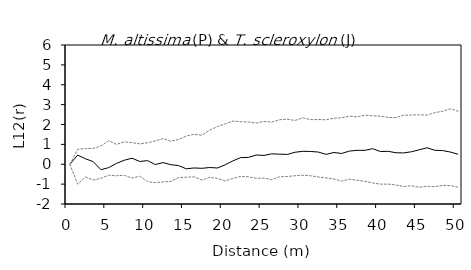
| Category | L12(r) | E12- | E12+ |
|---|---|---|---|
| 0.0 | 0 | 0 | 0 |
| 1.0 | 0.461 | -1 | 0.748 |
| 2.0 | 0.276 | -0.641 | 0.791 |
| 3.0 | 0.131 | -0.794 | 0.793 |
| 4.0 | -0.275 | -0.707 | 0.92 |
| 5.0 | -0.169 | -0.552 | 1.181 |
| 6.0 | 0.041 | -0.578 | 1 |
| 7.0 | 0.202 | -0.555 | 1.125 |
| 8.0 | 0.304 | -0.695 | 1.084 |
| 9.0 | 0.141 | -0.602 | 1.026 |
| 10.0 | 0.183 | -0.874 | 1.079 |
| 11.0 | -0.015 | -0.923 | 1.179 |
| 12.0 | 0.083 | -0.893 | 1.289 |
| 13.0 | -0.022 | -0.863 | 1.161 |
| 14.0 | -0.068 | -0.67 | 1.247 |
| 15.0 | -0.23 | -0.652 | 1.423 |
| 16.0 | -0.186 | -0.634 | 1.508 |
| 17.0 | -0.205 | -0.796 | 1.459 |
| 18.0 | -0.164 | -0.654 | 1.713 |
| 19.0 | -0.188 | -0.716 | 1.896 |
| 20.0 | -0.028 | -0.836 | 2.033 |
| 21.0 | 0.17 | -0.716 | 2.172 |
| 22.0 | 0.334 | -0.608 | 2.14 |
| 23.0 | 0.344 | -0.633 | 2.126 |
| 24.0 | 0.464 | -0.705 | 2.074 |
| 25.0 | 0.445 | -0.693 | 2.154 |
| 26.0 | 0.524 | -0.779 | 2.122 |
| 27.0 | 0.507 | -0.631 | 2.24 |
| 28.0 | 0.495 | -0.615 | 2.268 |
| 29.0 | 0.604 | -0.579 | 2.202 |
| 30.0 | 0.651 | -0.551 | 2.337 |
| 31.0 | 0.644 | -0.578 | 2.244 |
| 32.0 | 0.612 | -0.643 | 2.251 |
| 33.0 | 0.499 | -0.686 | 2.236 |
| 34.0 | 0.591 | -0.739 | 2.317 |
| 35.0 | 0.542 | -0.848 | 2.33 |
| 36.0 | 0.663 | -0.752 | 2.423 |
| 37.0 | 0.7 | -0.809 | 2.383 |
| 38.0 | 0.7 | -0.862 | 2.467 |
| 39.0 | 0.784 | -0.943 | 2.439 |
| 40.0 | 0.639 | -1.001 | 2.417 |
| 41.0 | 0.651 | -1 | 2.355 |
| 42.0 | 0.578 | -1.042 | 2.348 |
| 43.0 | 0.571 | -1.121 | 2.468 |
| 44.0 | 0.629 | -1.083 | 2.476 |
| 45.0 | 0.729 | -1.159 | 2.49 |
| 46.0 | 0.828 | -1.105 | 2.474 |
| 47.0 | 0.702 | -1.126 | 2.598 |
| 48.0 | 0.688 | -1.064 | 2.666 |
| 49.0 | 0.615 | -1.075 | 2.784 |
| 50.0 | 0.504 | -1.15 | 2.671 |